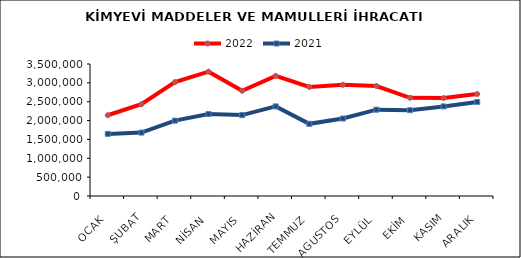
| Category | 2022 | 2021 |
|---|---|---|
| OCAK | 2141368.148 | 1646847.384 |
| ŞUBAT | 2432160.609 | 1680900.643 |
| MART | 3019385.652 | 1998413.444 |
| NİSAN | 3297075.907 | 2173651.44 |
| MAYIS | 2789454.864 | 2145366.824 |
| HAZİRAN | 3185526.582 | 2376087.937 |
| TEMMUZ | 2890896.549 | 1914049.999 |
| AGUSTOS | 2947258.87 | 2054054.995 |
| EYLÜL | 2916914.381 | 2288959.136 |
| EKİM | 2603968.026 | 2274998.895 |
| KASIM | 2597275.791 | 2375390.464 |
| ARALIK | 2703341.009 | 2494537.794 |